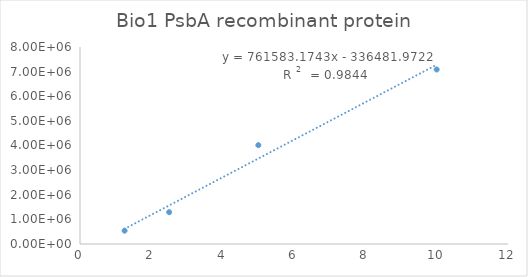
| Category | Series 0 |
|---|---|
| 10.0 | 7085905.1 |
| 5.0 | 4014536.37 |
| 2.5 | 1292281.25 |
| 1.25 | 541033.91 |